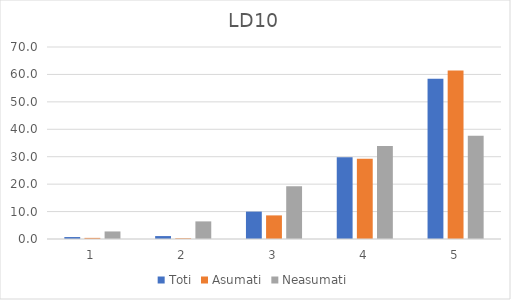
| Category | Toti | Asumati | Neasumati |
|---|---|---|---|
| 0 | 0.713 | 0.41 | 2.752 |
| 1 | 1.07 | 0.273 | 6.422 |
| 2 | 9.988 | 8.607 | 19.266 |
| 3 | 29.845 | 29.235 | 33.945 |
| 4 | 58.383 | 61.475 | 37.615 |